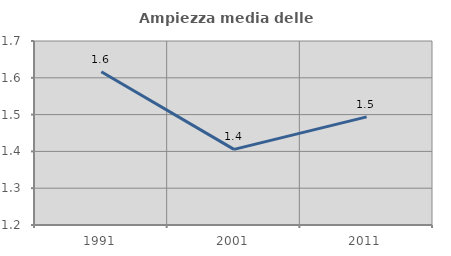
| Category | Ampiezza media delle famiglie |
|---|---|
| 1991.0 | 1.616 |
| 2001.0 | 1.405 |
| 2011.0 | 1.494 |